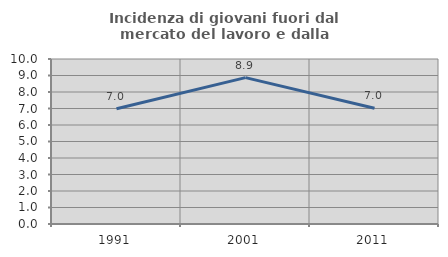
| Category | Incidenza di giovani fuori dal mercato del lavoro e dalla formazione  |
|---|---|
| 1991.0 | 6.985 |
| 2001.0 | 8.871 |
| 2011.0 | 7.011 |